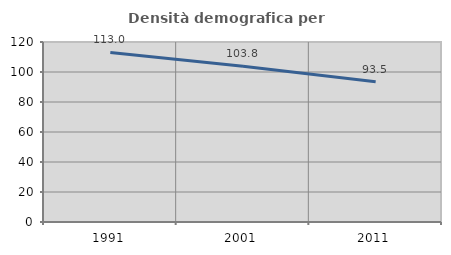
| Category | Densità demografica |
|---|---|
| 1991.0 | 113.039 |
| 2001.0 | 103.766 |
| 2011.0 | 93.455 |